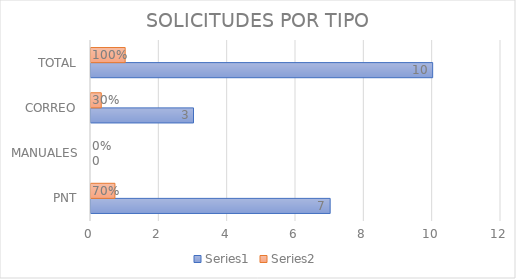
| Category | Series 0 | Series 1 |
|---|---|---|
| PNT | 7 | 0.7 |
| MANUALES | 0 | 0 |
| CORREO | 3 | 0.3 |
| TOTAL | 10 | 1 |